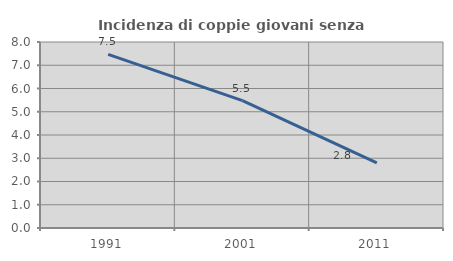
| Category | Incidenza di coppie giovani senza figli |
|---|---|
| 1991.0 | 7.471 |
| 2001.0 | 5.481 |
| 2011.0 | 2.796 |